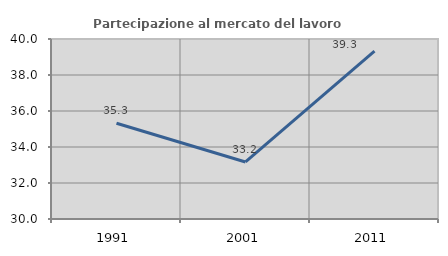
| Category | Partecipazione al mercato del lavoro  femminile |
|---|---|
| 1991.0 | 35.321 |
| 2001.0 | 33.168 |
| 2011.0 | 39.326 |